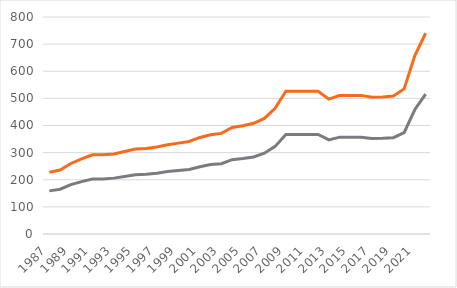
| Category | Houshold_Size_Two | r |
|---|---|---|
| 1987.0 | 159 | 228 |
| 1988.0 | 165 | 236 |
| 1989.0 | 182 | 260 |
| 1990.0 | 193 | 277 |
| 1991.0 | 203 | 292 |
| 1992.0 | 203 | 292 |
| 1993.0 | 206 | 295 |
| 1994.0 | 212 | 304 |
| 1995.0 | 218 | 313 |
| 1996.0 | 220 | 315 |
| 1997.0 | 224 | 321 |
| 1998.0 | 230 | 329 |
| 1999.0 | 234 | 335 |
| 2000.0 | 238 | 341 |
| 2001.0 | 248 | 356 |
| 2002.0 | 256 | 366 |
| 2003.0 | 259 | 371 |
| 2004.0 | 274 | 393 |
| 2005.0 | 278 | 399 |
| 2006.0 | 284 | 408 |
| 2007.0 | 298 | 426 |
| 2008.0 | 323 | 463 |
| 2009.0 | 367 | 526 |
| 2010.0 | 367 | 526 |
| 2011.0 | 367 | 526 |
| 2012.0 | 367 | 526 |
| 2013.0 | 347 | 497 |
| 2014.0 | 357 | 511 |
| 2015.0 | 357 | 511 |
| 2016.0 | 357 | 511 |
| 2017.0 | 352 | 504 |
| 2018.0 | 353 | 505 |
| 2019.0 | 355 | 509 |
| 2020.0 | 374 | 535 |
| 2021.0 | 459 | 658 |
| 2022.0 | 516 | 740 |